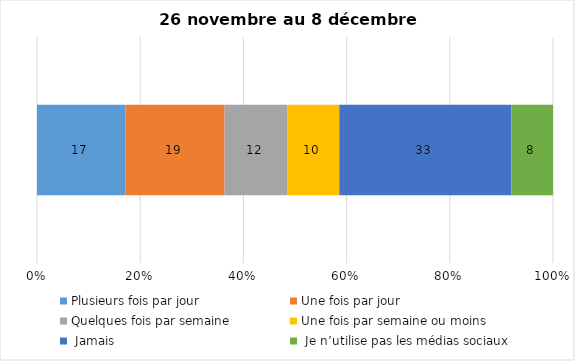
| Category | Plusieurs fois par jour | Une fois par jour | Quelques fois par semaine   | Une fois par semaine ou moins   |  Jamais   |  Je n’utilise pas les médias sociaux |
|---|---|---|---|---|---|---|
| 0 | 17 | 19 | 12 | 10 | 33 | 8 |